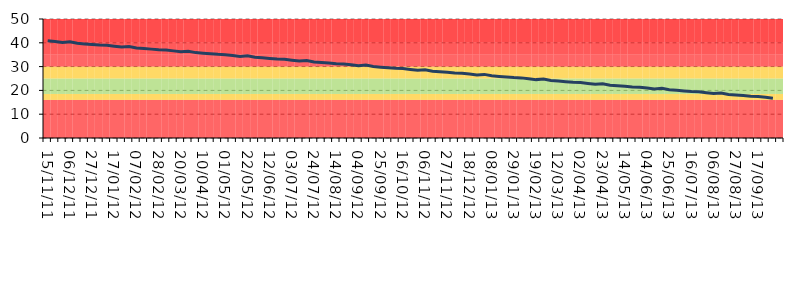
| Category | Series 1 | Series 2 | Series 3 | Series 4 | Series 5 | Series 6 | Series 7 |
|---|---|---|---|---|---|---|---|
| 15/11/11 | 16 | 2.5 | 6.5 | 5 | 5 | 5 | 10 |
| 22/11/11 | 16 | 2.5 | 6.5 | 5 | 5 | 5 | 10 |
| 29/11/11 | 16 | 2.5 | 6.5 | 5 | 5 | 5 | 10 |
| 06/12/11 | 16 | 2.5 | 6.5 | 5 | 5 | 5 | 10 |
| 13/12/11 | 16 | 2.5 | 6.5 | 5 | 5 | 5 | 10 |
| 20/12/11 | 16 | 2.5 | 6.5 | 5 | 5 | 5 | 10 |
| 27/12/11 | 16 | 2.5 | 6.5 | 5 | 5 | 5 | 10 |
| 03/01/12 | 16 | 2.5 | 6.5 | 5 | 5 | 5 | 10 |
| 10/01/12 | 16 | 2.5 | 6.5 | 5 | 5 | 5 | 10 |
| 17/01/12 | 16 | 2.5 | 6.5 | 5 | 5 | 5 | 10 |
| 24/01/12 | 16 | 2.5 | 6.5 | 5 | 5 | 5 | 10 |
| 31/01/12 | 16 | 2.5 | 6.5 | 5 | 5 | 5 | 10 |
| 07/02/12 | 16 | 2.5 | 6.5 | 5 | 5 | 5 | 10 |
| 14/02/12 | 16 | 2.5 | 6.5 | 5 | 5 | 5 | 10 |
| 21/02/12 | 16 | 2.5 | 6.5 | 5 | 5 | 5 | 10 |
| 28/02/12 | 16 | 2.5 | 6.5 | 5 | 5 | 5 | 10 |
| 06/03/12 | 16 | 2.5 | 6.5 | 5 | 5 | 5 | 10 |
| 13/03/12 | 16 | 2.5 | 6.5 | 5 | 5 | 5 | 10 |
| 20/03/12 | 16 | 2.5 | 6.5 | 5 | 5 | 5 | 10 |
| 27/03/12 | 16 | 2.5 | 6.5 | 5 | 5 | 5 | 10 |
| 03/04/12 | 16 | 2.5 | 6.5 | 5 | 5 | 5 | 10 |
| 10/04/12 | 16 | 2.5 | 6.5 | 5 | 5 | 5 | 10 |
| 17/04/12 | 16 | 2.5 | 6.5 | 5 | 5 | 5 | 10 |
| 24/04/12 | 16 | 2.5 | 6.5 | 5 | 5 | 5 | 10 |
| 01/05/12 | 16 | 2.5 | 6.5 | 5 | 5 | 5 | 10 |
| 08/05/12 | 16 | 2.5 | 6.5 | 5 | 5 | 5 | 10 |
| 15/05/12 | 16 | 2.5 | 6.5 | 5 | 5 | 5 | 10 |
| 22/05/12 | 16 | 2.5 | 6.5 | 5 | 5 | 5 | 10 |
| 29/05/12 | 16 | 2.5 | 6.5 | 5 | 5 | 5 | 10 |
| 05/06/12 | 16 | 2.5 | 6.5 | 5 | 5 | 5 | 10 |
| 12/06/12 | 16 | 2.5 | 6.5 | 5 | 5 | 5 | 10 |
| 19/06/12 | 16 | 2.5 | 6.5 | 5 | 5 | 5 | 10 |
| 26/06/12 | 16 | 2.5 | 6.5 | 5 | 5 | 5 | 10 |
| 03/07/12 | 16 | 2.5 | 6.5 | 5 | 5 | 5 | 10 |
| 10/07/12 | 16 | 2.5 | 6.5 | 5 | 5 | 5 | 10 |
| 17/07/12 | 16 | 2.5 | 6.5 | 5 | 5 | 5 | 10 |
| 24/07/12 | 16 | 2.5 | 6.5 | 5 | 5 | 5 | 10 |
| 31/07/12 | 16 | 2.5 | 6.5 | 5 | 5 | 5 | 10 |
| 07/08/12 | 16 | 2.5 | 6.5 | 5 | 5 | 5 | 10 |
| 14/08/12 | 16 | 2.5 | 6.5 | 5 | 5 | 5 | 10 |
| 21/08/12 | 16 | 2.5 | 6.5 | 5 | 5 | 5 | 10 |
| 28/08/12 | 16 | 2.5 | 6.5 | 5 | 5 | 5 | 10 |
| 04/09/12 | 16 | 2.5 | 6.5 | 5 | 5 | 5 | 10 |
| 11/09/12 | 16 | 2.5 | 6.5 | 5 | 5 | 5 | 10 |
| 18/09/12 | 16 | 2.5 | 6.5 | 5 | 5 | 5 | 10 |
| 25/09/12 | 16 | 2.5 | 6.5 | 5 | 5 | 5 | 10 |
| 02/10/12 | 16 | 2.5 | 6.5 | 5 | 5 | 5 | 10 |
| 09/10/12 | 16 | 2.5 | 6.5 | 5 | 5 | 5 | 10 |
| 16/10/12 | 16 | 2.5 | 6.5 | 5 | 5 | 5 | 10 |
| 23/10/12 | 16 | 2.5 | 6.5 | 5 | 5 | 5 | 10 |
| 30/10/12 | 16 | 2.5 | 6.5 | 5 | 5 | 5 | 10 |
| 06/11/12 | 16 | 2.5 | 6.5 | 5 | 5 | 5 | 10 |
| 13/11/12 | 16 | 2.5 | 6.5 | 5 | 5 | 5 | 10 |
| 20/11/12 | 16 | 2.5 | 6.5 | 5 | 5 | 5 | 10 |
| 27/11/12 | 16 | 2.5 | 6.5 | 5 | 5 | 5 | 10 |
| 04/12/12 | 16 | 2.5 | 6.5 | 5 | 5 | 5 | 10 |
| 11/12/12 | 16 | 2.5 | 6.5 | 5 | 5 | 5 | 10 |
| 18/12/12 | 16 | 2.5 | 6.5 | 5 | 5 | 5 | 10 |
| 25/12/12 | 16 | 2.5 | 6.5 | 5 | 5 | 5 | 10 |
| 01/01/13 | 16 | 2.5 | 6.5 | 5 | 5 | 5 | 10 |
| 08/01/13 | 16 | 2.5 | 6.5 | 5 | 5 | 5 | 10 |
| 15/01/13 | 16 | 2.5 | 6.5 | 5 | 5 | 5 | 10 |
| 22/01/13 | 16 | 2.5 | 6.5 | 5 | 5 | 5 | 10 |
| 29/01/13 | 16 | 2.5 | 6.5 | 5 | 5 | 5 | 10 |
| 05/02/13 | 16 | 2.5 | 6.5 | 5 | 5 | 5 | 10 |
| 12/02/13 | 16 | 2.5 | 6.5 | 5 | 5 | 5 | 10 |
| 19/02/13 | 16 | 2.5 | 6.5 | 5 | 5 | 5 | 10 |
| 26/02/13 | 16 | 2.5 | 6.5 | 5 | 5 | 5 | 10 |
| 05/03/13 | 16 | 2.5 | 6.5 | 5 | 5 | 5 | 10 |
| 12/03/13 | 16 | 2.5 | 6.5 | 5 | 5 | 5 | 10 |
| 19/03/13 | 16 | 2.5 | 6.5 | 5 | 5 | 5 | 10 |
| 26/03/13 | 16 | 2.5 | 6.5 | 5 | 5 | 5 | 10 |
| 02/04/13 | 16 | 2.5 | 6.5 | 5 | 5 | 5 | 10 |
| 09/04/13 | 16 | 2.5 | 6.5 | 5 | 5 | 5 | 10 |
| 16/04/13 | 16 | 2.5 | 6.5 | 5 | 5 | 5 | 10 |
| 23/04/13 | 16 | 2.5 | 6.5 | 5 | 5 | 5 | 10 |
| 30/04/13 | 16 | 2.5 | 6.5 | 5 | 5 | 5 | 10 |
| 07/05/13 | 16 | 2.5 | 6.5 | 5 | 5 | 5 | 10 |
| 14/05/13 | 16 | 2.5 | 6.5 | 5 | 5 | 5 | 10 |
| 21/05/13 | 16 | 2.5 | 6.5 | 5 | 5 | 5 | 10 |
| 28/05/13 | 16 | 2.5 | 6.5 | 5 | 5 | 5 | 10 |
| 04/06/13 | 16 | 2.5 | 6.5 | 5 | 5 | 5 | 10 |
| 11/06/13 | 16 | 2.5 | 6.5 | 5 | 5 | 5 | 10 |
| 18/06/13 | 16 | 2.5 | 6.5 | 5 | 5 | 5 | 10 |
| 25/06/13 | 16 | 2.5 | 6.5 | 5 | 5 | 5 | 10 |
| 02/07/13 | 16 | 2.5 | 6.5 | 5 | 5 | 5 | 10 |
| 09/07/13 | 16 | 2.5 | 6.5 | 5 | 5 | 5 | 10 |
| 16/07/13 | 16 | 2.5 | 6.5 | 5 | 5 | 5 | 10 |
| 23/07/13 | 16 | 2.5 | 6.5 | 5 | 5 | 5 | 10 |
| 30/07/13 | 16 | 2.5 | 6.5 | 5 | 5 | 5 | 10 |
| 06/08/13 | 16 | 2.5 | 6.5 | 5 | 5 | 5 | 10 |
| 13/08/13 | 16 | 2.5 | 6.5 | 5 | 5 | 5 | 10 |
| 20/08/13 | 16 | 2.5 | 6.5 | 5 | 5 | 5 | 10 |
| 27/08/13 | 16 | 2.5 | 6.5 | 5 | 5 | 5 | 10 |
| 03/09/13 | 16 | 2.5 | 6.5 | 5 | 5 | 5 | 10 |
| 10/09/13 | 16 | 2.5 | 6.5 | 5 | 5 | 5 | 10 |
| 17/09/13 | 16 | 2.5 | 6.5 | 5 | 5 | 5 | 10 |
| 24/09/13 | 16 | 2.5 | 6.5 | 5 | 5 | 5 | 10 |
| 01/10/13 | 16 | 2.5 | 6.5 | 5 | 5 | 5 | 10 |